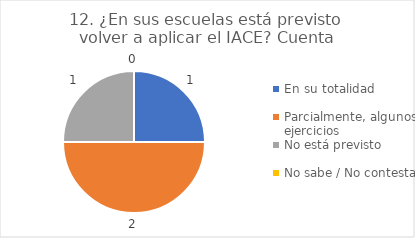
| Category | 12. ¿En sus escuelas está previsto volver a aplicar el IACE? |
|---|---|
| En su totalidad  | 0.25 |
| Parcialmente, algunos ejercicios  | 0.5 |
| No está previsto  | 0.25 |
| No sabe / No contesta | 0 |